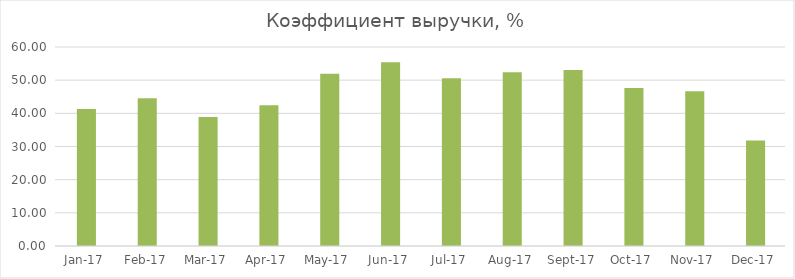
| Category | Коэффициент выручки, % |
|---|---|
| 2017-01-01 | 41.333 |
| 2017-02-01 | 44.571 |
| 2017-03-01 | 38.889 |
| 2017-04-01 | 42.424 |
| 2017-05-01 | 51.923 |
| 2017-06-01 | 55.405 |
| 2017-07-01 | 50.562 |
| 2017-08-01 | 52.381 |
| 2017-09-01 | 53.061 |
| 2017-10-01 | 47.619 |
| 2017-11-01 | 46.667 |
| 2017-12-01 | 31.818 |